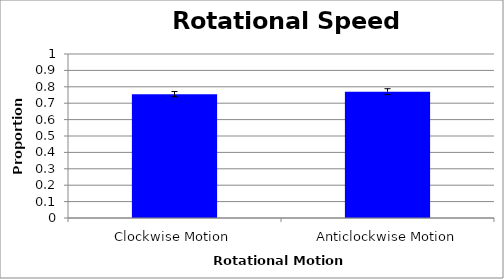
| Category | prop corr |
|---|---|
| Clockwise Motion | 0.755 |
| Anticlockwise Motion | 0.77 |